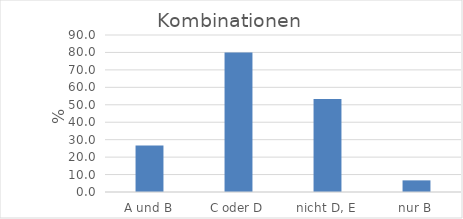
| Category | Kombinationen |
|---|---|
| A und B | 26.667 |
| C oder D | 80 |
| nicht D, E | 53.333 |
| nur B | 6.667 |